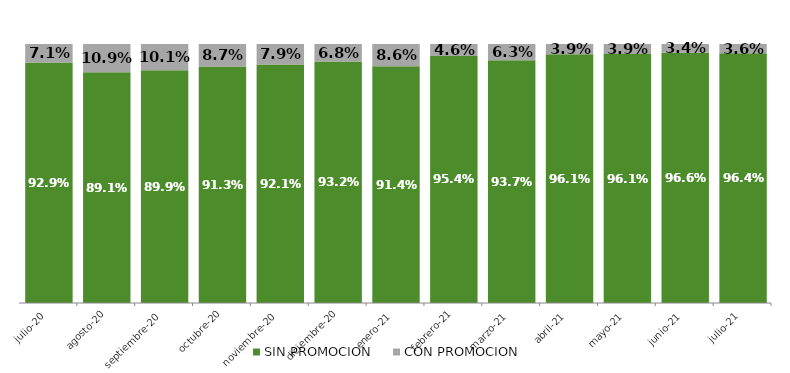
| Category | SIN PROMOCION   | CON PROMOCION   |
|---|---|---|
| 2020-07-01 | 0.929 | 0.071 |
| 2020-08-01 | 0.891 | 0.109 |
| 2020-09-01 | 0.899 | 0.101 |
| 2020-10-01 | 0.913 | 0.087 |
| 2020-11-01 | 0.921 | 0.079 |
| 2020-12-01 | 0.932 | 0.068 |
| 2021-01-01 | 0.914 | 0.086 |
| 2021-02-01 | 0.954 | 0.046 |
| 2021-03-01 | 0.937 | 0.063 |
| 2021-04-01 | 0.961 | 0.039 |
| 2021-05-01 | 0.961 | 0.039 |
| 2021-06-01 | 0.966 | 0.034 |
| 2021-07-01 | 0.964 | 0.036 |